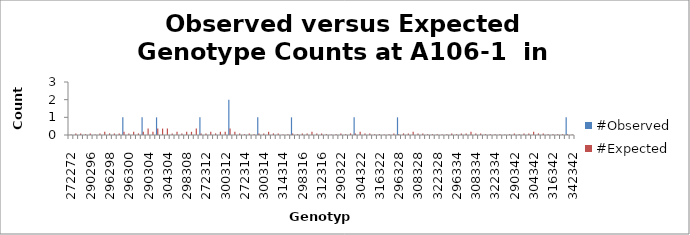
| Category | #Observed | #Expected |
|---|---|---|
| 272272.0 | 0 | 0.023 |
| 272290.0 | 0 | 0.091 |
| 290290.0 | 0 | 0.091 |
| 272296.0 | 0 | 0.045 |
| 290296.0 | 0 | 0.091 |
| 296296.0 | 0 | 0.023 |
| 272298.0 | 0 | 0.091 |
| 290298.0 | 0 | 0.182 |
| 296298.0 | 0 | 0.091 |
| 298298.0 | 0 | 0.091 |
| 272300.0 | 0 | 0.091 |
| 290300.0 | 1 | 0.182 |
| 296300.0 | 0 | 0.091 |
| 298300.0 | 0 | 0.182 |
| 300300.0 | 0 | 0.091 |
| 272304.0 | 1 | 0.182 |
| 290304.0 | 0 | 0.364 |
| 296304.0 | 0 | 0.182 |
| 298304.0 | 1 | 0.364 |
| 300304.0 | 0 | 0.364 |
| 304304.0 | 0 | 0.364 |
| 272308.0 | 0 | 0.091 |
| 290308.0 | 0 | 0.182 |
| 296308.0 | 0 | 0.091 |
| 298308.0 | 0 | 0.182 |
| 300308.0 | 0 | 0.182 |
| 304308.0 | 0 | 0.364 |
| 308308.0 | 1 | 0.091 |
| 272312.0 | 0 | 0.091 |
| 290312.0 | 0 | 0.182 |
| 296312.0 | 0 | 0.091 |
| 298312.0 | 0 | 0.182 |
| 300312.0 | 0 | 0.182 |
| 304312.0 | 2 | 0.364 |
| 308312.0 | 0 | 0.182 |
| 312312.0 | 0 | 0.091 |
| 272314.0 | 0 | 0.045 |
| 290314.0 | 0 | 0.091 |
| 296314.0 | 0 | 0.045 |
| 298314.0 | 1 | 0.091 |
| 300314.0 | 0 | 0.091 |
| 304314.0 | 0 | 0.182 |
| 308314.0 | 0 | 0.091 |
| 312314.0 | 0 | 0.091 |
| 314314.0 | 0 | 0.023 |
| 272316.0 | 0 | 0.045 |
| 290316.0 | 1 | 0.091 |
| 296316.0 | 0 | 0.045 |
| 298316.0 | 0 | 0.091 |
| 300316.0 | 0 | 0.091 |
| 304316.0 | 0 | 0.182 |
| 308316.0 | 0 | 0.091 |
| 312316.0 | 0 | 0.091 |
| 314316.0 | 0 | 0.045 |
| 316316.0 | 0 | 0.023 |
| 272322.0 | 0 | 0.045 |
| 290322.0 | 0 | 0.091 |
| 296322.0 | 0 | 0.045 |
| 298322.0 | 0 | 0.091 |
| 300322.0 | 1 | 0.091 |
| 304322.0 | 0 | 0.182 |
| 308322.0 | 0 | 0.091 |
| 312322.0 | 0 | 0.091 |
| 314322.0 | 0 | 0.045 |
| 316322.0 | 0 | 0.045 |
| 322322.0 | 0 | 0.023 |
| 272328.0 | 0 | 0.045 |
| 290328.0 | 0 | 0.091 |
| 296328.0 | 1 | 0.045 |
| 298328.0 | 0 | 0.091 |
| 300328.0 | 0 | 0.091 |
| 304328.0 | 0 | 0.182 |
| 308328.0 | 0 | 0.091 |
| 312328.0 | 0 | 0.091 |
| 314328.0 | 0 | 0.045 |
| 316328.0 | 0 | 0.045 |
| 322328.0 | 0 | 0.045 |
| 328328.0 | 0 | 0.023 |
| 272334.0 | 0 | 0.045 |
| 290334.0 | 0 | 0.091 |
| 296334.0 | 0 | 0.045 |
| 298334.0 | 0 | 0.091 |
| 300334.0 | 0 | 0.091 |
| 304334.0 | 0 | 0.182 |
| 308334.0 | 0 | 0.091 |
| 312334.0 | 0 | 0.091 |
| 314334.0 | 0 | 0.045 |
| 316334.0 | 0 | 0.045 |
| 322334.0 | 0 | 0.045 |
| 328334.0 | 0 | 0.045 |
| 334334.0 | 0 | 0.023 |
| 272342.0 | 0 | 0.045 |
| 290342.0 | 0 | 0.091 |
| 296342.0 | 0 | 0.045 |
| 298342.0 | 0 | 0.091 |
| 300342.0 | 0 | 0.091 |
| 304342.0 | 0 | 0.182 |
| 308342.0 | 0 | 0.091 |
| 312342.0 | 0 | 0.091 |
| 314342.0 | 0 | 0.045 |
| 316342.0 | 0 | 0.045 |
| 322342.0 | 0 | 0.045 |
| 328342.0 | 0 | 0.045 |
| 334342.0 | 1 | 0.045 |
| 342342.0 | 0 | 0.023 |